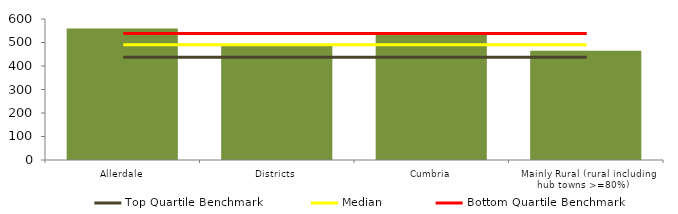
| Category | Block Data |
|---|---|
| Allerdale | 560.1 |
| Districts | 485.81 |
| Cumbria | 532.933 |
|  Mainly Rural (rural including hub towns >=80%)   | 464.808 |